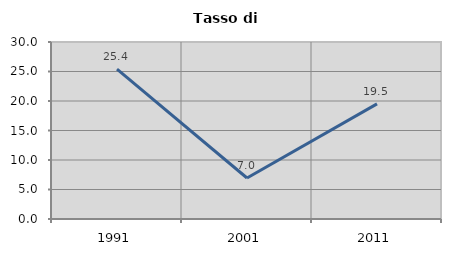
| Category | Tasso di disoccupazione   |
|---|---|
| 1991.0 | 25.403 |
| 2001.0 | 6.952 |
| 2011.0 | 19.512 |